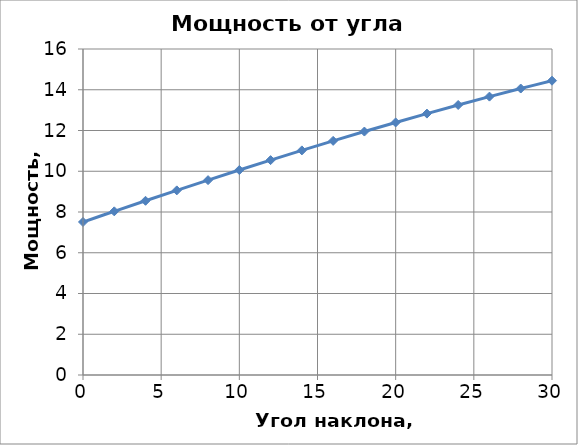
| Category | Series 0 |
|---|---|
| 0.0 | 7.509 |
| 2.0 | 8.033 |
| 4.0 | 8.55 |
| 6.0 | 9.061 |
| 8.0 | 9.564 |
| 10.0 | 10.06 |
| 12.0 | 10.546 |
| 14.0 | 11.024 |
| 16.0 | 11.491 |
| 18.0 | 11.948 |
| 20.0 | 12.395 |
| 22.0 | 12.83 |
| 24.0 | 13.252 |
| 26.0 | 13.663 |
| 28.0 | 14.06 |
| 30.0 | 14.444 |